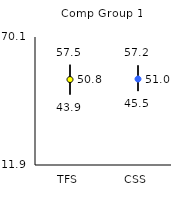
| Category | 25th | 75th | Mean |
|---|---|---|---|
| TFS | 43.9 | 57.5 | 50.76 |
| CSS | 45.5 | 57.2 | 51 |